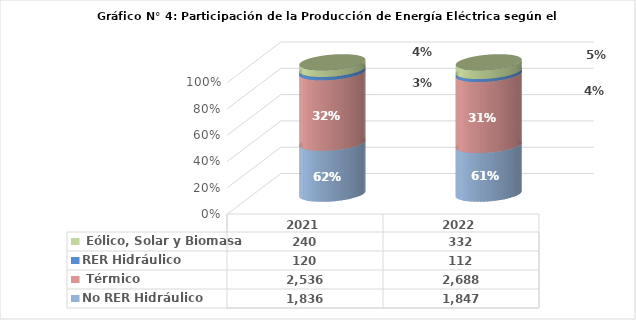
| Category | No RER | RER |
|---|---|---|
| 2021.0 | 2535.508 | 240.19 |
| 2022.0 | 2687.972 | 332.184 |